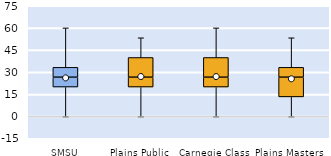
| Category | 25th | 50th | 75th |
|---|---|---|---|
| SMSU | 20 | 6.667 | 6.667 |
| Plains Public | 20 | 6.667 | 13.333 |
| Carnegie Class | 20 | 6.667 | 13.333 |
| Plains Masters | 13.333 | 13.333 | 6.667 |